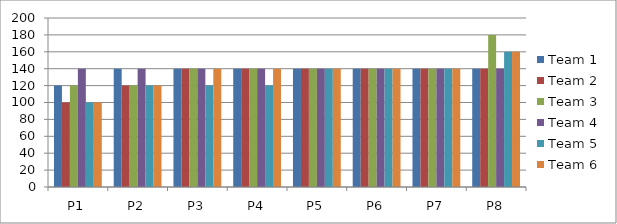
| Category | Team 1 | Team 2 | Team 3 | Team 4 | Team 5 | Team 6 |
|---|---|---|---|---|---|---|
| P1 | 120 | 100 | 120 | 140 | 100 | 100 |
| P2 | 140 | 120 | 120 | 140 | 120 | 120 |
| P3 | 140 | 140 | 140 | 140 | 120 | 140 |
| P4 | 140 | 140 | 140 | 140 | 120 | 140 |
| P5 | 140 | 140 | 140 | 140 | 140 | 140 |
| P6 | 140 | 140 | 140 | 140 | 140 | 140 |
| P7 | 140 | 140 | 140 | 140 | 140 | 140 |
| P8 | 140 | 140 | 180 | 140 | 160 | 160 |